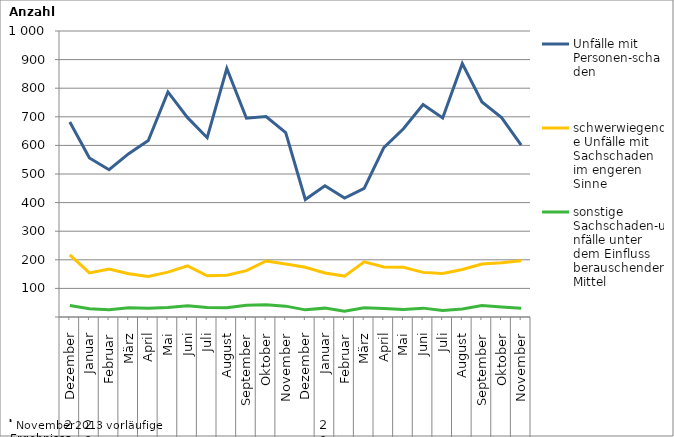
| Category | Unfälle mit Personen-schaden | schwerwiegende Unfälle mit Sachschaden   im engeren Sinne | sonstige Sachschaden-unfälle unter dem Einfluss berauschender Mittel |
|---|---|---|---|
| 0 | 682 | 217 | 40 |
| 1 | 556 | 154 | 29 |
| 2 | 515 | 168 | 25 |
| 3 | 571 | 151 | 32 |
| 4 | 617 | 142 | 31 |
| 5 | 787 | 157 | 33 |
| 6 | 697 | 179 | 39 |
| 7 | 627 | 144 | 33 |
| 8 | 869 | 146 | 32 |
| 9 | 695 | 162 | 41 |
| 10 | 701 | 196 | 43 |
| 11 | 645 | 185 | 38 |
| 12 | 411 | 174 | 25 |
| 13 | 459 | 154 | 31 |
| 14 | 416 | 143 | 20 |
| 15 | 450 | 193 | 32 |
| 16 | 592 | 175 | 30 |
| 17 | 658 | 174 | 26 |
| 18 | 743 | 156 | 31 |
| 19 | 696 | 152 | 23 |
| 20 | 886 | 166 | 28 |
| 21 | 752 | 185 | 40 |
| 22 | 697 | 190 | 35 |
| 23 | 601 | 197 | 31 |